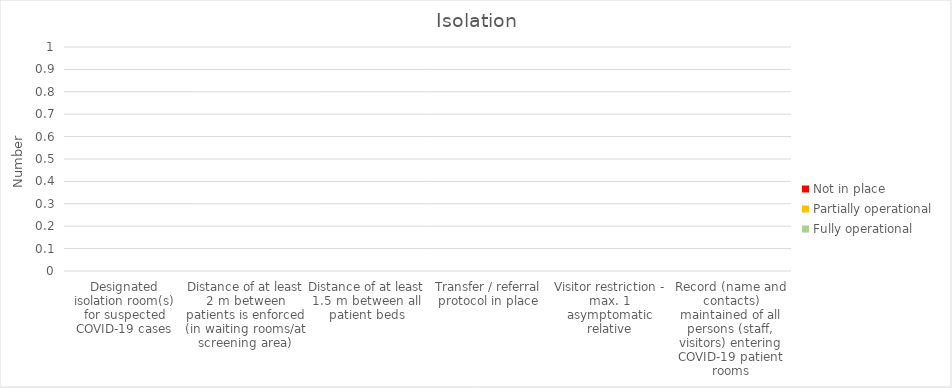
| Category | Fully operational | Partially operational | Not in place |
|---|---|---|---|
| Designated isolation room(s) for suspected COVID-19 cases | 0 | 0 | 0 |
| Distance of at least 2 m between patients is enforced (in waiting rooms/at screening area) | 0 | 0 | 0 |
| Distance of at least 1.5 m between all patient beds | 0 | 0 | 0 |
| Transfer / referral protocol in place | 0 | 0 | 0 |
| Visitor restriction - max. 1 asymptomatic relative | 0 | 0 | 0 |
| Record (name and contacts) maintained of all persons (staff, visitors) entering COVID-19 patient rooms | 0 | 0 | 0 |